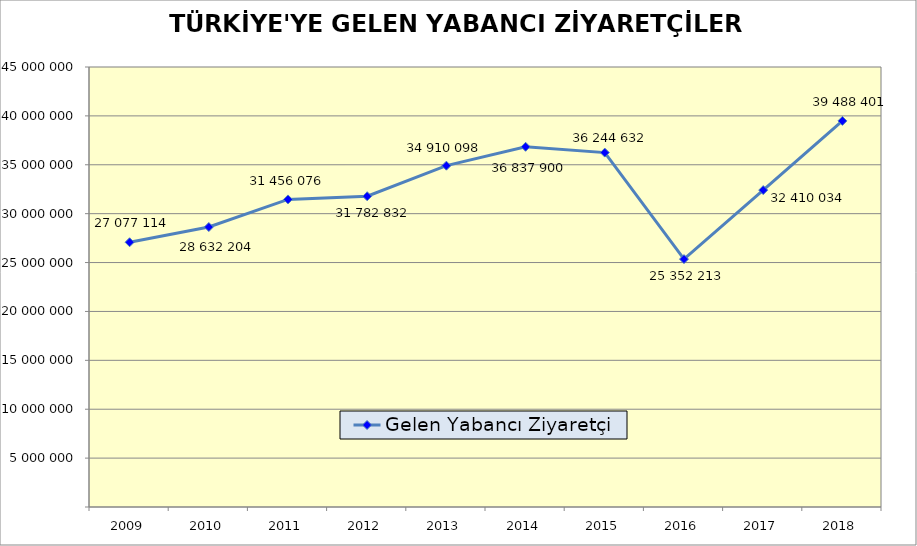
| Category | Gelen Yabancı Ziyaretçi |
|---|---|
| 2009 | 27077114 |
| 2010 | 28632204 |
| 2011 | 31456076 |
| 2012 | 31782832 |
| 2013 | 34910098 |
| 2014 | 36837900 |
| 2015 | 36244632 |
| 2016 | 25352213 |
| 2017 | 32410034 |
| 2018 | 39488401 |